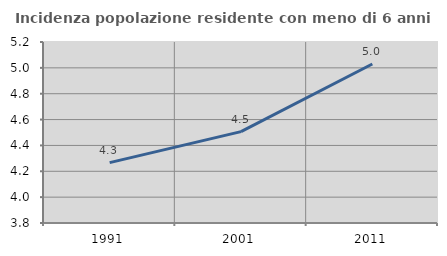
| Category | Incidenza popolazione residente con meno di 6 anni |
|---|---|
| 1991.0 | 4.267 |
| 2001.0 | 4.507 |
| 2011.0 | 5.03 |